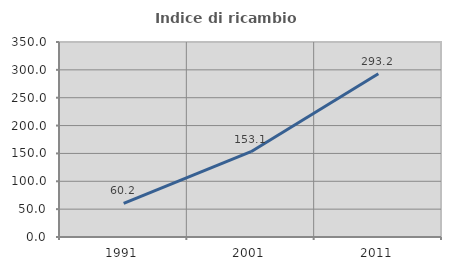
| Category | Indice di ricambio occupazionale  |
|---|---|
| 1991.0 | 60.215 |
| 2001.0 | 153.061 |
| 2011.0 | 293.182 |